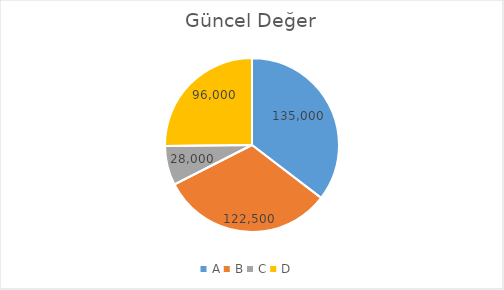
| Category | Güncel Değer |
|---|---|
| A | 135000 |
| B | 122500 |
| C | 28000 |
| D | 96000 |